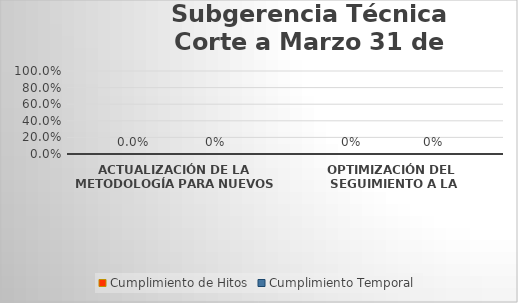
| Category | Cumplimiento de Hitos | Cumplimiento Temporal |
|---|---|---|
| ACTUALIZACIÓN DE LA  METODOLOGÍA PARA NUEVOS NEGOCIOS  | 0 | 0 |
| OPTIMIZACIÓN DEL  SEGUIMIENTO A LA SUPERVISIÓN DE PROYECTOS | 0 | 0 |